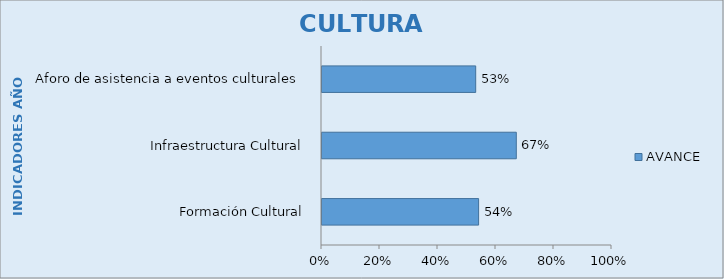
| Category | AVANCE  |
|---|---|
| Formación Cultural | 0.54 |
| Infraestructura Cultural | 0.67 |
| Aforo de asistencia a eventos culturales  | 0.53 |